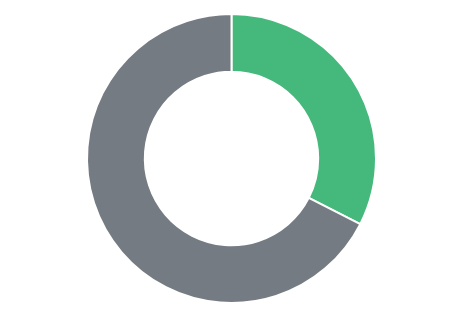
| Category | Series 0 |
|---|---|
| 0 | 285982 |
| 1 | 594026 |